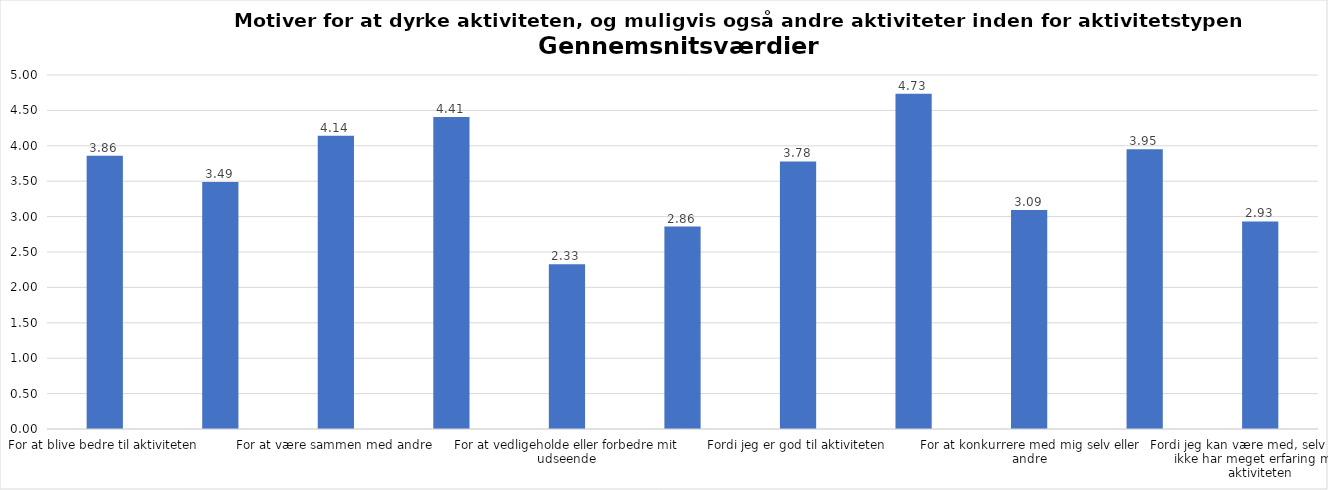
| Category | Gennemsnit |
|---|---|
| For at blive bedre til aktiviteten | 3.859 |
| For at vedligeholde eller forbedre min sundhed (fx helbred, fysisk form) | 3.49 |
| For at være sammen med andre | 4.141 |
| For at gøre noget godt for mig selv | 4.406 |
| For at vedligeholde eller forbedre mit udseende | 2.328 |
| Fordi andre i min omgangskreds opmuntrer mig til det | 2.859 |
| Fordi jeg er god til aktiviteten | 3.779 |
| Fordi jeg godt kan lide aktiviteten | 4.735 |
| For at konkurrere med mig selv eller andre | 3.093 |
| Fordi aktiviteten passer godt ind i min hverdag | 3.952 |
| Fordi jeg kan være med, selv om jeg ikke har meget erfaring med aktiviteten | 2.931 |